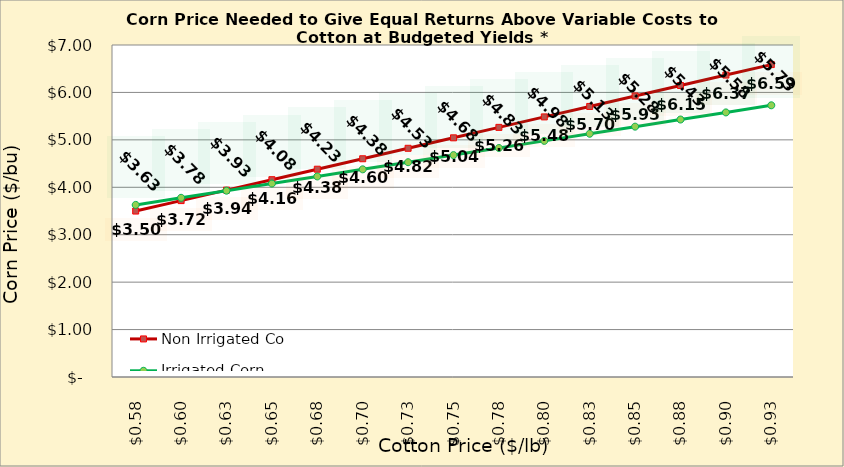
| Category | Non Irrigated Corn | Irrigated Corn |
|---|---|---|
| 0.5749999999999998 | 3.499 | 3.629 |
| 0.5999999999999999 | 3.719 | 3.779 |
| 0.6249999999999999 | 3.94 | 3.929 |
| 0.6499999999999999 | 4.16 | 4.079 |
| 0.6749999999999999 | 4.381 | 4.229 |
| 0.7 | 4.602 | 4.379 |
| 0.725 | 4.822 | 4.529 |
| 0.75 | 5.043 | 4.679 |
| 0.775 | 5.263 | 4.829 |
| 0.8 | 5.484 | 4.979 |
| 0.8250000000000001 | 5.705 | 5.129 |
| 0.8500000000000001 | 5.925 | 5.279 |
| 0.8750000000000001 | 6.146 | 5.429 |
| 0.9000000000000001 | 6.366 | 5.579 |
| 0.9250000000000002 | 6.587 | 5.729 |